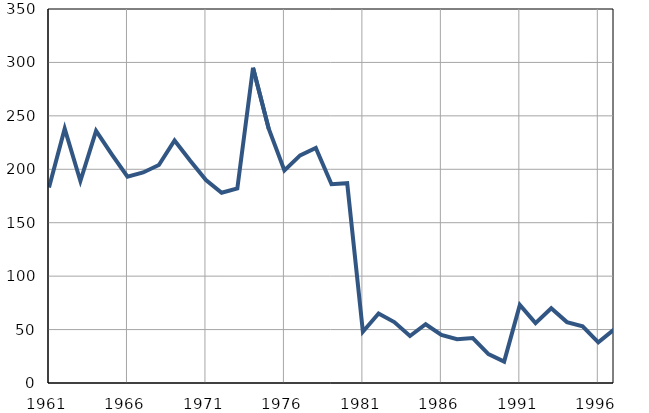
| Category | Умрла 
одојчад |
|---|---|
| 1961.0 | 183 |
| 1962.0 | 238 |
| 1963.0 | 189 |
| 1964.0 | 236 |
| 1965.0 | 214 |
| 1966.0 | 193 |
| 1967.0 | 197 |
| 1968.0 | 204 |
| 1969.0 | 227 |
| 1970.0 | 208 |
| 1971.0 | 190 |
| 1972.0 | 178 |
| 1973.0 | 182 |
| 1974.0 | 295 |
| 1975.0 | 238 |
| 1976.0 | 199 |
| 1977.0 | 213 |
| 1978.0 | 220 |
| 1979.0 | 186 |
| 1980.0 | 187 |
| 1981.0 | 48 |
| 1982.0 | 65 |
| 1983.0 | 57 |
| 1984.0 | 44 |
| 1985.0 | 55 |
| 1986.0 | 45 |
| 1987.0 | 41 |
| 1988.0 | 42 |
| 1989.0 | 27 |
| 1990.0 | 20 |
| 1991.0 | 73 |
| 1992.0 | 56 |
| 1993.0 | 70 |
| 1994.0 | 57 |
| 1995.0 | 53 |
| 1996.0 | 38 |
| 1997.0 | 50 |